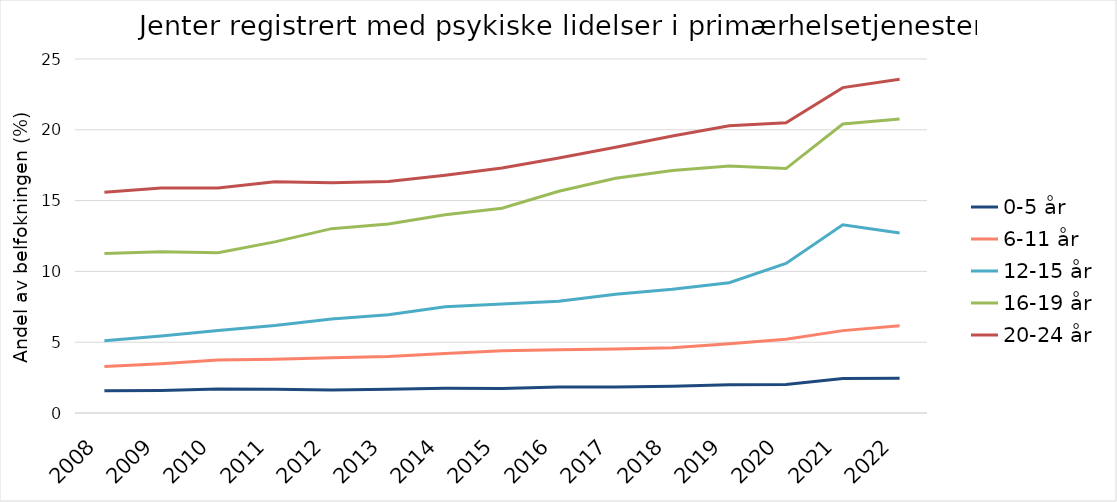
| Category | 0-5 år | 6-11 år | 12-15 år | 16-19 år | 20-24 år |
|---|---|---|---|---|---|
| 2008.0 | 1.573 | 3.281 | 5.111 | 11.261 | 15.596 |
| 2009.0 | 1.594 | 3.477 | 5.441 | 11.395 | 15.883 |
| 2010.0 | 1.699 | 3.744 | 5.83 | 11.323 | 15.893 |
| 2011.0 | 1.674 | 3.797 | 6.176 | 12.087 | 16.339 |
| 2012.0 | 1.619 | 3.91 | 6.635 | 13.019 | 16.253 |
| 2013.0 | 1.677 | 3.987 | 6.932 | 13.345 | 16.344 |
| 2014.0 | 1.74 | 4.205 | 7.499 | 14.005 | 16.798 |
| 2015.0 | 1.725 | 4.401 | 7.699 | 14.462 | 17.307 |
| 2016.0 | 1.836 | 4.463 | 7.896 | 15.663 | 18.015 |
| 2017.0 | 1.835 | 4.525 | 8.383 | 16.573 | 18.772 |
| 2018.0 | 1.886 | 4.606 | 8.732 | 17.12 | 19.568 |
| 2019.0 | 1.995 | 4.894 | 9.203 | 17.435 | 20.286 |
| 2020.0 | 2.01 | 5.209 | 10.563 | 17.263 | 20.501 |
| 2021.0 | 2.444 | 5.817 | 13.292 | 20.408 | 22.98 |
| 2022.0 | 2.449 | 6.166 | 12.706 | 20.761 | 23.574 |